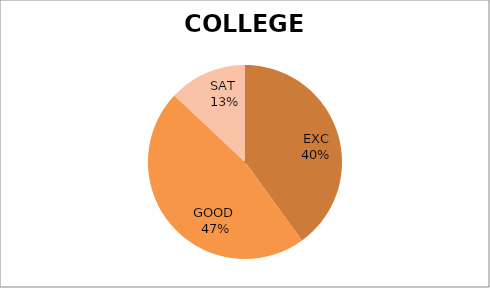
| Category | Series 0 |
|---|---|
| EXC | 40 |
| GOOD  | 47 |
| SAT  | 13 |